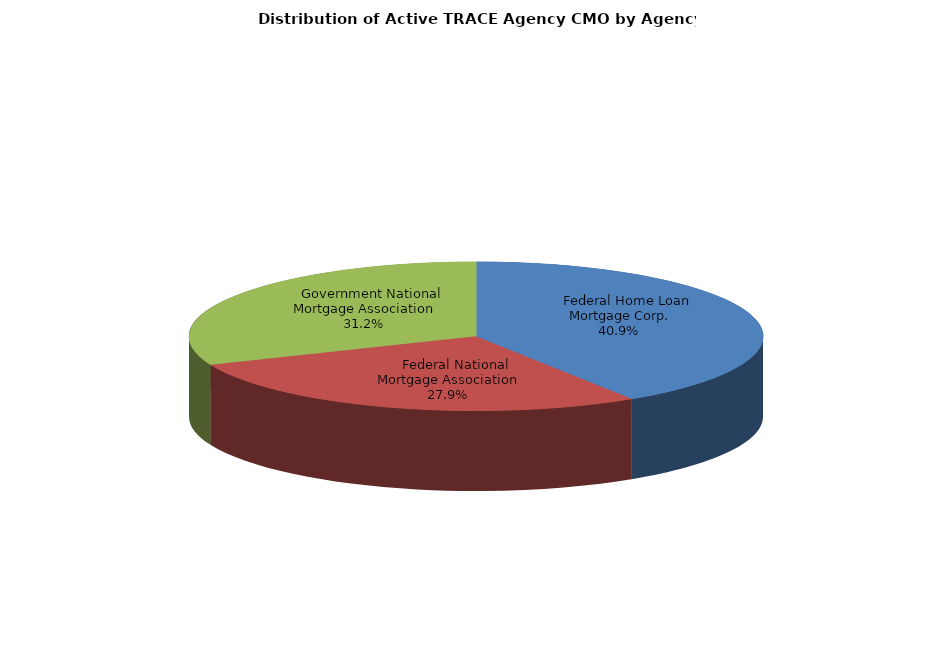
| Category | Series 0 |
|---|---|
|     Federal Home Loan Mortgage Corp. | 90259 |
|     Federal National Mortgage Association | 61462 |
|     Government National Mortgage Association | 68950 |